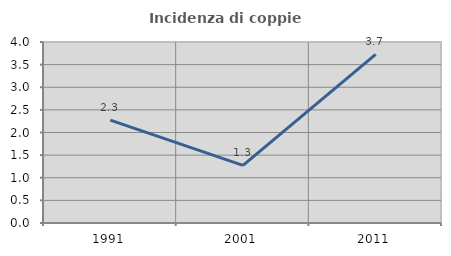
| Category | Incidenza di coppie miste |
|---|---|
| 1991.0 | 2.273 |
| 2001.0 | 1.274 |
| 2011.0 | 3.727 |